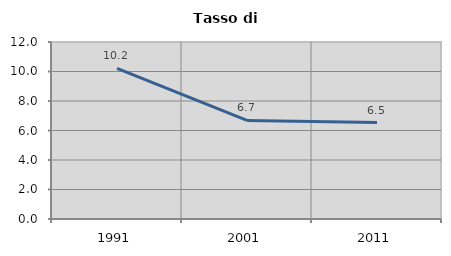
| Category | Tasso di disoccupazione   |
|---|---|
| 1991.0 | 10.21 |
| 2001.0 | 6.681 |
| 2011.0 | 6.541 |